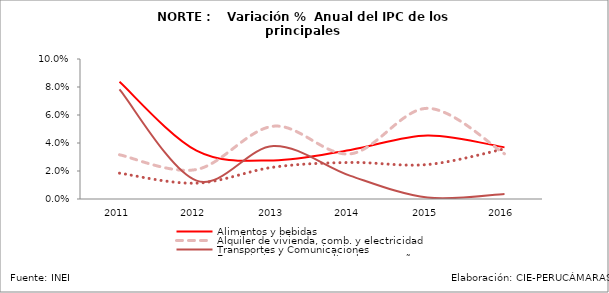
| Category | Alimentos y bebidas | Alquiler de vivienda, comb. y electricidad | Transportes y Comunicaciones | Esparcimiento, serv. culturales y ensañanza |
|---|---|---|---|---|
| 2011.0 | 0.084 | 0.032 | 0.078 | 0.018 |
| 2012.0 | 0.035 | 0.021 | 0.013 | 0.011 |
| 2013.0 | 0.028 | 0.052 | 0.038 | 0.023 |
| 2014.0 | 0.035 | 0.032 | 0.017 | 0.026 |
| 2015.0 | 0.045 | 0.065 | 0.001 | 0.025 |
| 2016.0 | 0.037 | 0.032 | 0.004 | 0.036 |